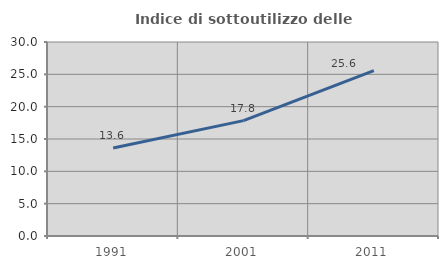
| Category | Indice di sottoutilizzo delle abitazioni  |
|---|---|
| 1991.0 | 13.621 |
| 2001.0 | 17.841 |
| 2011.0 | 25.564 |